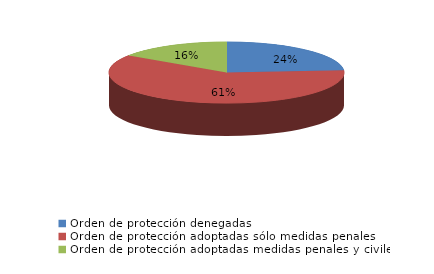
| Category | Series 0 |
|---|---|
| Orden de protección denegadas | 73 |
| Orden de protección adoptadas sólo medidas penales | 186 |
| Orden de protección adoptadas medidas penales y civiles | 48 |